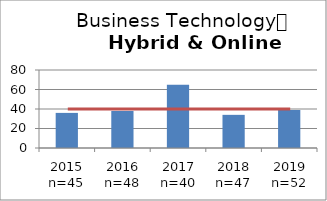
| Category | Scores |
|---|---|
| 2015 n=45 | 36 |
| 2016 n=48 | 38 |
| 2017 n=40 | 65 |
| 2018 n=47 | 34 |
| 2019 n=52 | 39 |